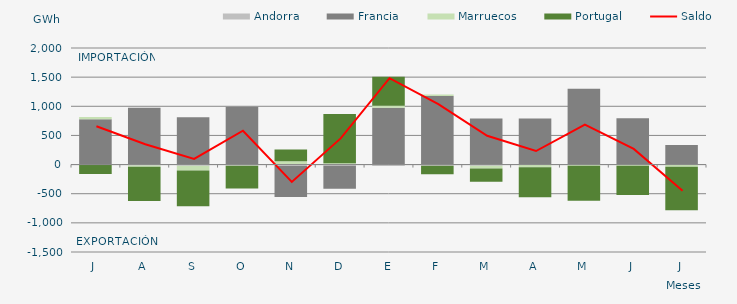
| Category | Andorra | Francia | Marruecos | Portugal |
|---|---|---|---|---|
| J | -1.488 | 777.149 | 40.929 | -159.488 |
| A | -16.745 | 974.066 | -21.389 | -587.13 |
| S | -21.816 | 812.203 | -79.308 | -613.114 |
| O | -14.818 | 993.522 | -4.279 | -393.484 |
| N | -22.557 | -531.947 | 57.949 | 199.161 |
| D | -20.764 | -396.046 | 21.949 | 843.669 |
| E | -24.438 | 973.605 | 35.757 | 497.454 |
| F | -19.197 | 1176.23 | 25.948 | -147.199 |
| M | -22.309 | 789.686 | -47.202 | -226.399 |
| A | -6.988 | 791.615 | -38.41 | -513.779 |
| M | -1.245 | 1302.344 | -18.608 | -598.82 |
| J | -0.008 | 792.83 | -21.038 | -502.886 |
| J | -5.052 | 334.729 | -33.385 | -747.138 |